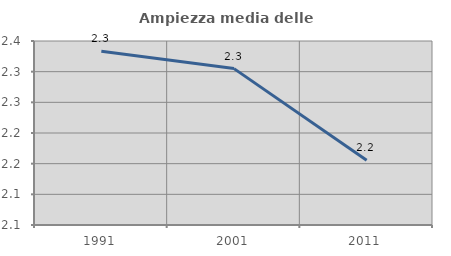
| Category | Ampiezza media delle famiglie |
|---|---|
| 1991.0 | 2.333 |
| 2001.0 | 2.305 |
| 2011.0 | 2.155 |